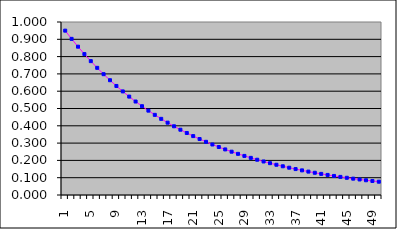
| Category | Series 1 |
|---|---|
| 1.0 | 0.95 |
| 2.0 | 0.902 |
| 3.0 | 0.857 |
| 4.0 | 0.815 |
| 5.0 | 0.774 |
| 6.0 | 0.735 |
| 7.0 | 0.698 |
| 8.0 | 0.663 |
| 9.0 | 0.63 |
| 10.0 | 0.599 |
| 11.0 | 0.569 |
| 12.0 | 0.54 |
| 13.0 | 0.513 |
| 14.0 | 0.488 |
| 15.0 | 0.463 |
| 16.0 | 0.44 |
| 17.0 | 0.418 |
| 18.0 | 0.397 |
| 19.0 | 0.377 |
| 20.0 | 0.358 |
| 21.0 | 0.341 |
| 22.0 | 0.324 |
| 23.0 | 0.307 |
| 24.0 | 0.292 |
| 25.0 | 0.277 |
| 26.0 | 0.264 |
| 27.0 | 0.25 |
| 28.0 | 0.238 |
| 29.0 | 0.226 |
| 30.0 | 0.215 |
| 31.0 | 0.204 |
| 32.0 | 0.194 |
| 33.0 | 0.184 |
| 34.0 | 0.175 |
| 35.0 | 0.166 |
| 36.0 | 0.158 |
| 37.0 | 0.15 |
| 38.0 | 0.142 |
| 39.0 | 0.135 |
| 40.0 | 0.129 |
| 41.0 | 0.122 |
| 42.0 | 0.116 |
| 43.0 | 0.11 |
| 44.0 | 0.105 |
| 45.0 | 0.099 |
| 46.0 | 0.094 |
| 47.0 | 0.09 |
| 48.0 | 0.085 |
| 49.0 | 0.081 |
| 50.0 | 0.077 |